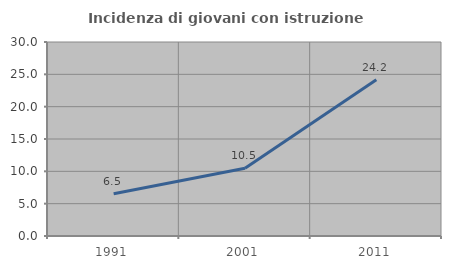
| Category | Incidenza di giovani con istruzione universitaria |
|---|---|
| 1991.0 | 6.534 |
| 2001.0 | 10.474 |
| 2011.0 | 24.167 |